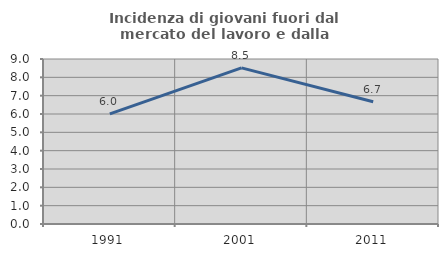
| Category | Incidenza di giovani fuori dal mercato del lavoro e dalla formazione  |
|---|---|
| 1991.0 | 6.009 |
| 2001.0 | 8.517 |
| 2011.0 | 6.664 |